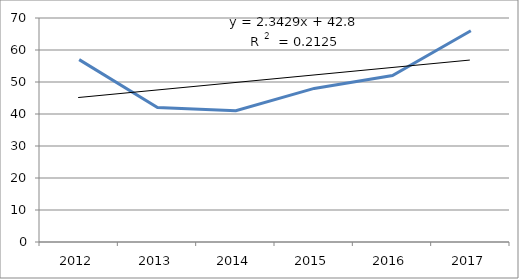
| Category | Series 0 |
|---|---|
| 2012.0 | 57 |
| 2013.0 | 42 |
| 2014.0 | 41 |
| 2015.0 | 48 |
| 2016.0 | 52 |
| 2017.0 | 66 |